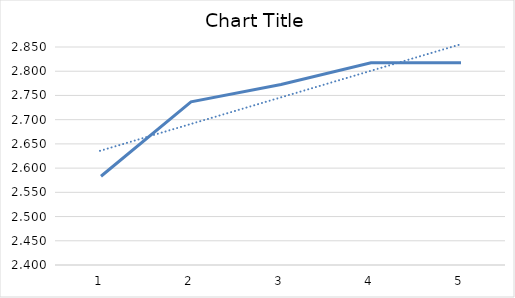
| Category | Series 0 |
|---|---|
| 0 | 2.583 |
| 1 | 2.737 |
| 2 | 2.773 |
| 3 | 2.817 |
| 4 | 2.817 |